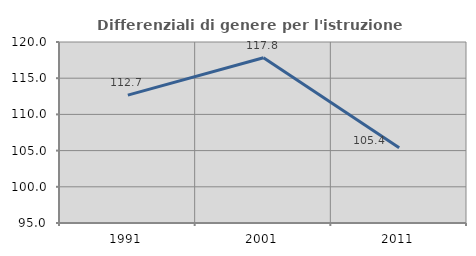
| Category | Differenziali di genere per l'istruzione superiore |
|---|---|
| 1991.0 | 112.655 |
| 2001.0 | 117.82 |
| 2011.0 | 105.396 |